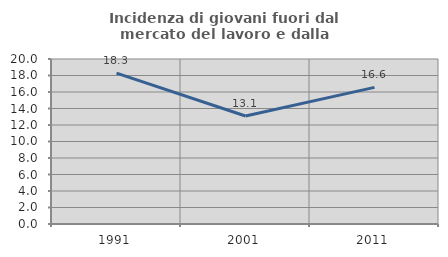
| Category | Incidenza di giovani fuori dal mercato del lavoro e dalla formazione  |
|---|---|
| 1991.0 | 18.288 |
| 2001.0 | 13.089 |
| 2011.0 | 16.564 |